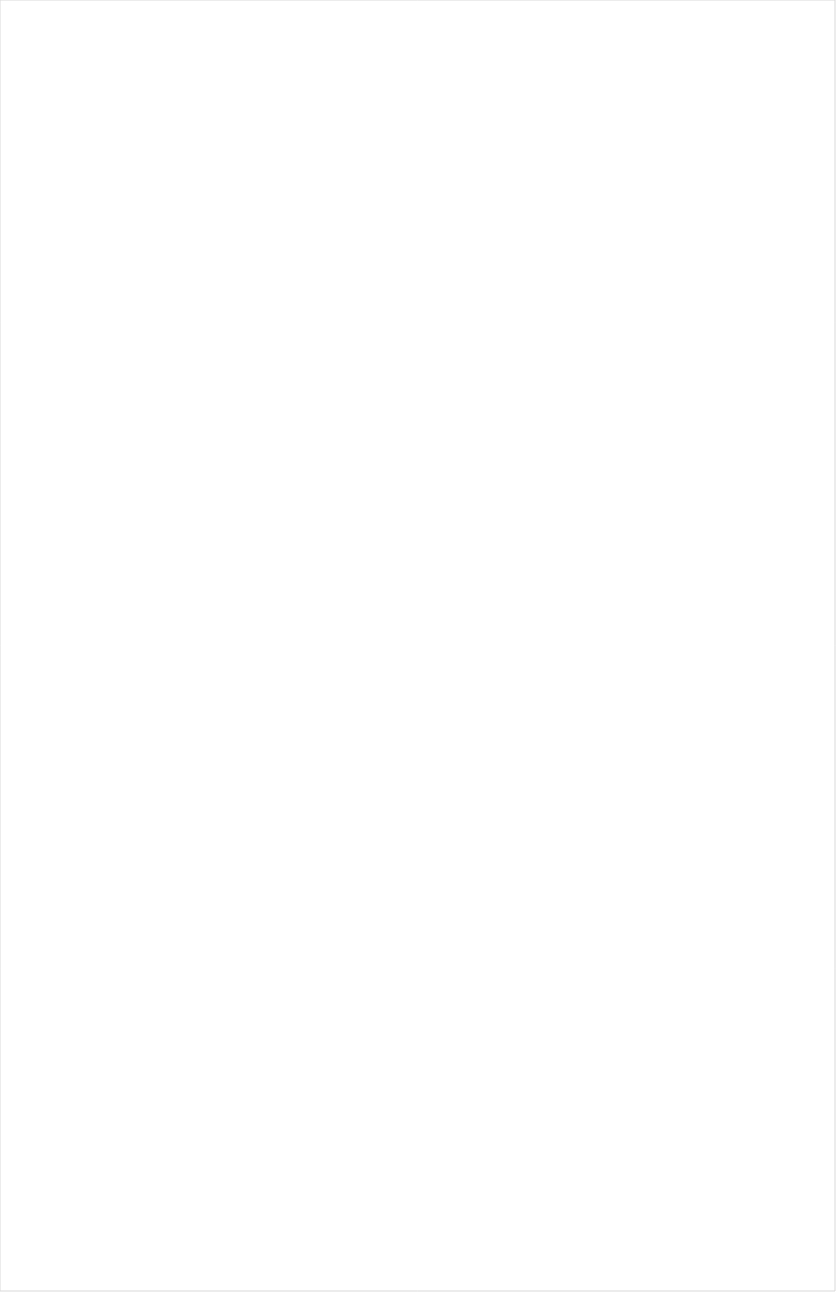
| Category | Total |
|---|---|
| Cartoon Network | -0.218 |
| Teen Nick | -0.217 |
| Nick Toons | -0.211 |
| Nick Jr. | -0.201 |
| Disney XD | -0.199 |
| MTV2 | -0.195 |
| Nick | -0.195 |
| VH1 | -0.192 |
| Disney Junior US | -0.187 |
| Disney Channel | -0.185 |
| Galavision | -0.183 |
| Univision | -0.181 |
| Telemundo | -0.167 |
| TUDN | -0.165 |
| Universal Kids | -0.16 |
| UniMas | -0.16 |
| Adult Swim | -0.16 |
| MTV | -0.153 |
| Nick@Nite | -0.151 |
| truTV | -0.146 |
| BET | -0.146 |
| NBC Universo | -0.141 |
| FXX | -0.111 |
| Freeform | -0.11 |
| ESPN2 | -0.104 |
| Comedy Central | -0.102 |
| TV ONE | -0.102 |
| ESPN Deportes | -0.1 |
| ESPN | -0.098 |
| BET Her | -0.098 |
| E! | -0.093 |
| FX | -0.085 |
| Logo | -0.082 |
| NFL Network | -0.078 |
| Paramount Network | -0.069 |
| TNT | -0.065 |
| BRAVO | -0.064 |
| FXDEP | -0.063 |
| NBA TV | -0.061 |
| USA Network | -0.057 |
| ESPNEWS | -0.055 |
| Viceland | -0.053 |
| ESPNU | -0.05 |
| A&E | -0.044 |
| Lifetime Movies | -0.044 |
| Discovery Family Channel | -0.041 |
| SYFY | -0.04 |
| TBS | -0.039 |
| Lifetime | -0.035 |
| NHL | -0.03 |
| TLC | -0.029 |
| Cooking Channel | -0.026 |
| Fox Sports 1 | -0.026 |
| WE TV | -0.021 |
| Big Ten Network | -0.016 |
| Independent Film (IFC) | -0.015 |
| MLB Network | -0.015 |
| AMC | -0.014 |
| Food Network | -0.014 |
| CW | -0.013 |
| FX Movie Channel | -0.012 |
| CNBC | -0.009 |
| Discovery Channel | -0.007 |
| Travel | -0.003 |
| Ovation | 0.001 |
| PAC-12 Network | 0.003 |
| Oprah Winfrey Network | 0.007 |
| CMTV | 0.01 |
| Investigation Discovery | 0.012 |
| Olympic Channel | 0.013 |
| Destination America | 0.013 |
| NBC Sports | 0.015 |
| FOX | 0.018 |
| Reelz Channel | 0.019 |
| The Sportsman Channel | 0.023 |
| BBC America | 0.025 |
| National Geographic | 0.029 |
| Discovery Life Channel | 0.032 |
| Motor Trend Network | 0.037 |
| Animal Planet | 0.041 |
| POP | 0.044 |
| Headline News | 0.044 |
| OXYGEN | 0.044 |
| UP TV | 0.047 |
| FYI | 0.048 |
| Game Show | 0.054 |
| FOX Sports 2 | 0.054 |
| HGTV | 0.055 |
| History Channel | 0.057 |
| ABC | 0.06 |
| CBS Sports | 0.068 |
| Outdoor Channel | 0.068 |
| NBC | 0.069 |
| ION | 0.069 |
| MyNetworkTV | 0.069 |
| DIY | 0.071 |
| CNN | 0.076 |
| WGN America | 0.079 |
| TV LAND | 0.082 |
| Golf | 0.091 |
| Science Channel | 0.093 |
| SundanceTV | 0.097 |
| American Heroes Channel | 0.098 |
| Bloomberg HD | 0.1 |
| National Geographic Wild | 0.1 |
| Great American Country | 0.108 |
| CBS | 0.119 |
| Weather Channel | 0.13 |
| Smithsonian | 0.142 |
| Tennis Channel | 0.15 |
| Fox News | 0.152 |
| Hallmark | 0.16 |
| MSNBC | 0.207 |
| INSP | 0.211 |
| Fox Business | 0.219 |
| Hallmark Movies & Mysteries | 0.247 |
| PBS | 0.249 |
| RFD TV | 0.314 |